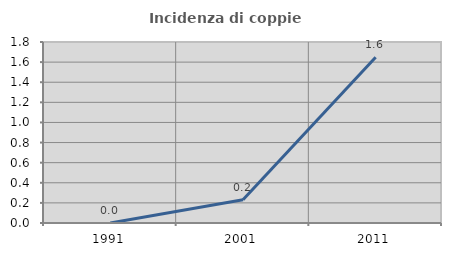
| Category | Incidenza di coppie miste |
|---|---|
| 1991.0 | 0 |
| 2001.0 | 0.231 |
| 2011.0 | 1.648 |